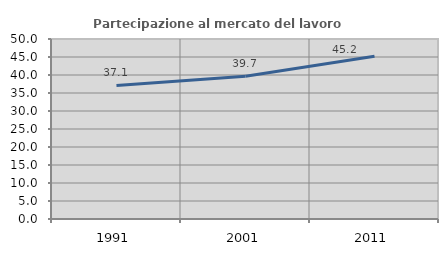
| Category | Partecipazione al mercato del lavoro  femminile |
|---|---|
| 1991.0 | 37.114 |
| 2001.0 | 39.67 |
| 2011.0 | 45.213 |